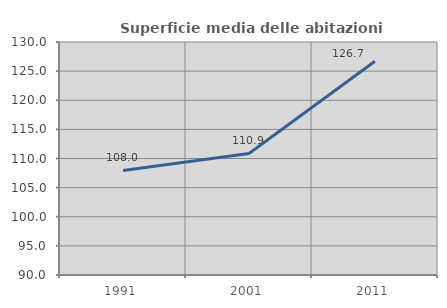
| Category | Superficie media delle abitazioni occupate |
|---|---|
| 1991.0 | 107.957 |
| 2001.0 | 110.865 |
| 2011.0 | 126.706 |